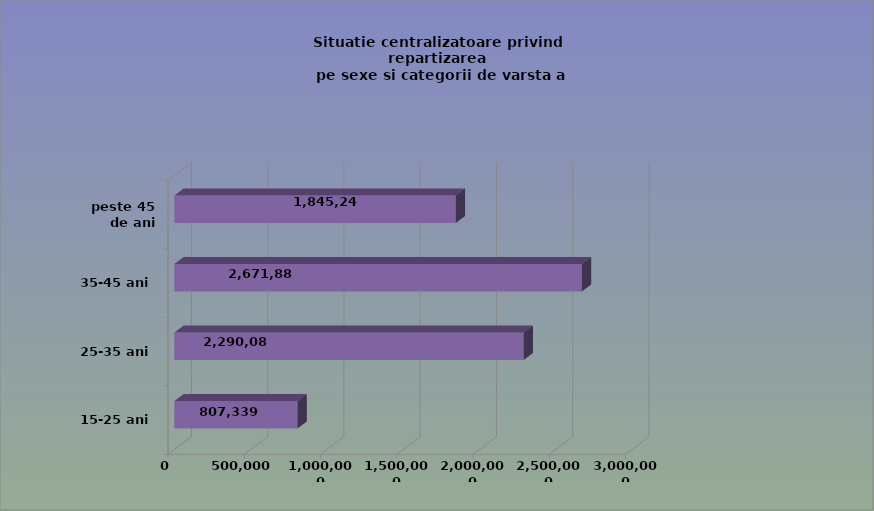
| Category | 15-25 ani 25-35 ani 35-45 ani peste 45 de ani |
|---|---|
| 15-25 ani | 807339 |
| 25-35 ani | 2290082 |
| 35-45 ani | 2671888 |
| peste 45 de ani | 1845241 |